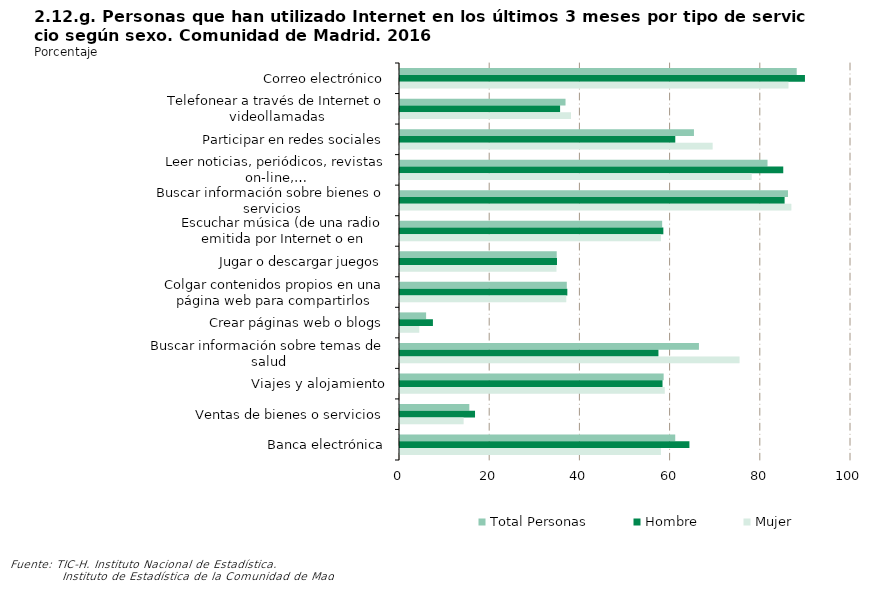
| Category | Total Personas | Hombre | Mujer |
|---|---|---|---|
| Correo electrónico | 87.967 | 89.791 | 86.137 |
| Telefonear a través de Internet o videollamadas | 36.701 | 35.497 | 37.91 |
| Participar en redes sociales | 65.176 | 61.038 | 69.328 |
| Leer noticias, periódicos, revistas on-line,… | 81.489 | 84.979 | 77.987 |
| Buscar información sobre bienes o servicios | 86.027 | 85.279 | 86.778 |
| Escuchar música (de una radio emitida por Internet o en streaming) | 58.13 | 58.391 | 57.867 |
| Jugar o descargar juegos | 34.752 | 34.809 | 34.696 |
| Colgar contenidos propios en una página web para compartirlos | 36.987 | 37.102 | 36.872 |
| Crear páginas web o blogs | 5.789 | 7.299 | 4.274 |
| Buscar información sobre temas de salud | 66.283 | 57.303 | 75.292 |
| Viajes y alojamiento | 58.458 | 58.208 | 58.709 |
| Ventas de bienes o servicios | 15.372 | 16.636 | 14.104 |
| Banca electrónica | 61.027 | 64.17 | 57.872 |